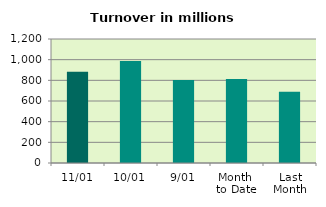
| Category | Series 0 |
|---|---|
| 11/01 | 883.687 |
| 10/01 | 987.684 |
| 9/01 | 802.535 |
| Month 
to Date | 812.539 |
| Last
Month | 689.27 |